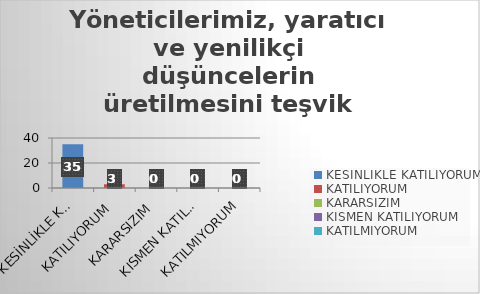
| Category | Yöneticilerimiz, yaratıcı ve yenilikçi düşüncelerin üretilmesini teşvik etmektedir. |
|---|---|
| KESİNLİKLE KATILIYORUM | 35 |
| KATILIYORUM | 3 |
| KARARSIZIM | 0 |
| KISMEN KATILIYORUM | 0 |
| KATILMIYORUM | 0 |